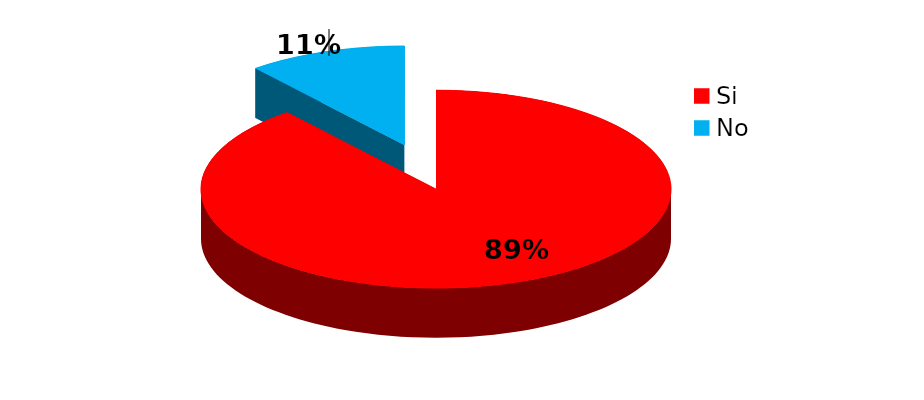
| Category | Series 0 |
|---|---|
| Si | 106 |
| No | 13 |